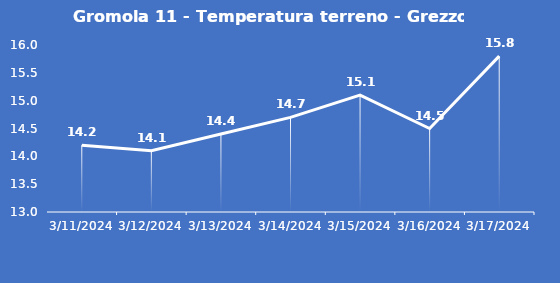
| Category | Gromola 11 - Temperatura terreno - Grezzo (°C) |
|---|---|
| 3/11/24 | 14.2 |
| 3/12/24 | 14.1 |
| 3/13/24 | 14.4 |
| 3/14/24 | 14.7 |
| 3/15/24 | 15.1 |
| 3/16/24 | 14.5 |
| 3/17/24 | 15.8 |